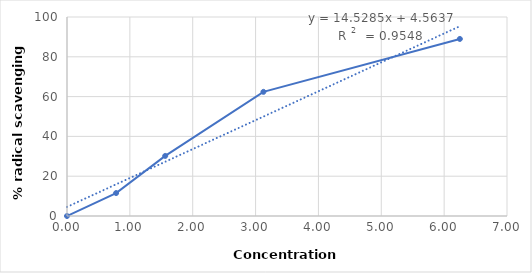
| Category | Series 0 |
|---|---|
| 0.0 | 0 |
| 0.78125 | 11.524 |
| 1.5625 | 30.194 |
| 3.125 | 62.382 |
| 6.25 | 88.975 |